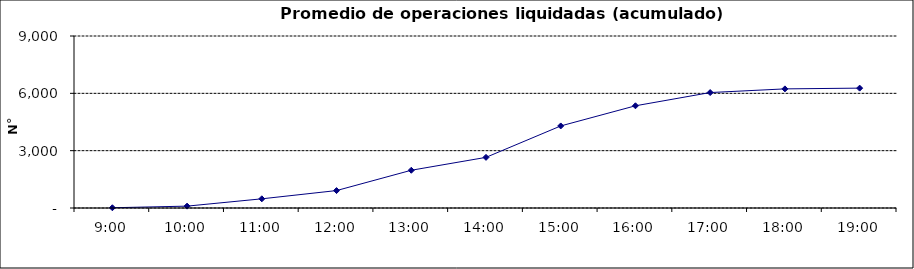
| Category | Promedio Op.Liquidadas (acumulado) |
|---|---|
| 0.375 | 12.591 |
| 0.4166666666666667 | 97.773 |
| 0.4583333333333333 | 480.409 |
| 0.5 | 911.909 |
| 0.5416666666666666 | 1975.227 |
| 0.5833333333333334 | 2649.455 |
| 0.625 | 4293.545 |
| 0.6666666666666666 | 5348.591 |
| 0.7083333333333334 | 6040.955 |
| 0.75 | 6232.909 |
| 0.7916666666666666 | 6272.409 |